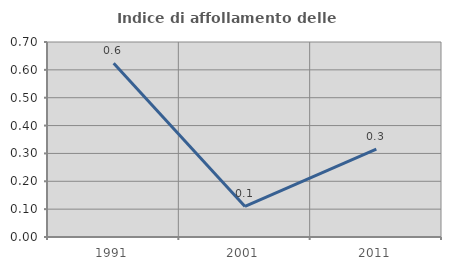
| Category | Indice di affollamento delle abitazioni  |
|---|---|
| 1991.0 | 0.623 |
| 2001.0 | 0.11 |
| 2011.0 | 0.315 |